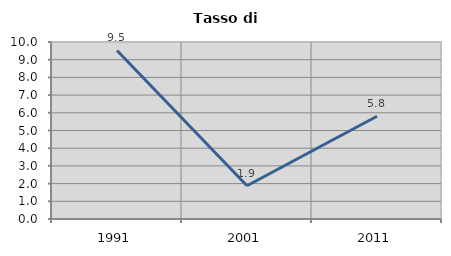
| Category | Tasso di disoccupazione   |
|---|---|
| 1991.0 | 9.524 |
| 2001.0 | 1.881 |
| 2011.0 | 5.806 |